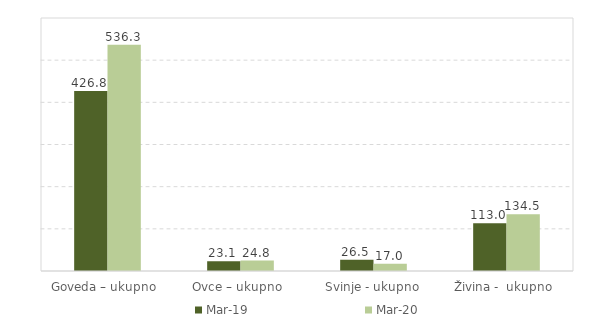
| Category | Mar-19 | Mar-20 |
|---|---|---|
| Goveda – ukupno  | 426.8 | 536.3 |
| Ovce – ukupno  | 23.1 | 24.8 |
| Svinje - ukupno | 26.5 | 17 |
| Živina -  ukupno  | 113 | 134.5 |